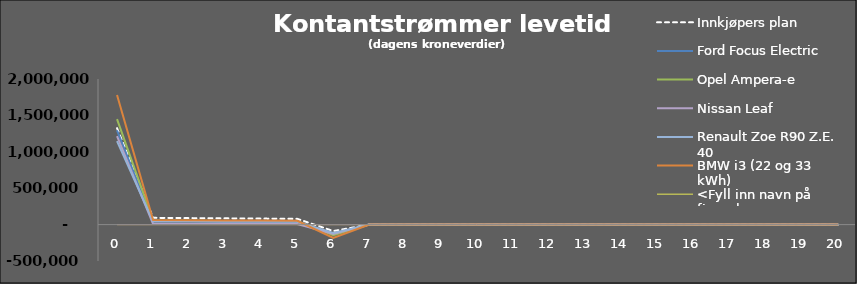
| Category |  Innkjøpers plan  |  Ford Focus Electric  |  Opel Ampera-e  |  Nissan Leaf  |  Renault Zoe R90 Z.E. 40  |  BMW i3 (22 og 33 kWh)  |  <Fyll inn navn på firma her>  |
|---|---|---|---|---|---|---|---|
| 0 | 1325000 | 1295000 | 1449500 | 1213910.353 | 1147000 | 1780000 | 0 |
| 1 | 92860.577 | 47486.25 | 54219.375 | 9692.308 | 43953.462 | 62040.192 | 0 |
| 2 | 89289.016 | 45659.856 | 52134.014 | 9319.527 | 42262.944 | 59654.031 | 0 |
| 3 | 85854.823 | 43903.707 | 50128.86 | 8961.083 | 40637.446 | 57359.645 | 0 |
| 4 | 82552.715 | 42215.103 | 48200.827 | 8616.426 | 39074.467 | 55153.505 | 0 |
| 5 | 79377.61 | 40591.446 | 46346.949 | 8285.025 | 37571.603 | 53032.216 | 0 |
| 6 | -88324.234 | -131545.982 | -146362.443 | -127039.108 | -114955.252 | -183467.46 | 0 |
| 7 | 0 | 0 | 0 | 0 | 0 | 0 | 0 |
| 8 | 0 | 0 | 0 | 0 | 0 | 0 | 0 |
| 9 | 0 | 0 | 0 | 0 | 0 | 0 | 0 |
| 10 | 0 | 0 | 0 | 0 | 0 | 0 | 0 |
| 11 | 0 | 0 | 0 | 0 | 0 | 0 | 0 |
| 12 | 0 | 0 | 0 | 0 | 0 | 0 | 0 |
| 13 | 0 | 0 | 0 | 0 | 0 | 0 | 0 |
| 14 | 0 | 0 | 0 | 0 | 0 | 0 | 0 |
| 15 | 0 | 0 | 0 | 0 | 0 | 0 | 0 |
| 16 | 0 | 0 | 0 | 0 | 0 | 0 | 0 |
| 17 | 0 | 0 | 0 | 0 | 0 | 0 | 0 |
| 18 | 0 | 0 | 0 | 0 | 0 | 0 | 0 |
| 19 | 0 | 0 | 0 | 0 | 0 | 0 | 0 |
| 20 | 0 | 0 | 0 | 0 | 0 | 0 | 0 |